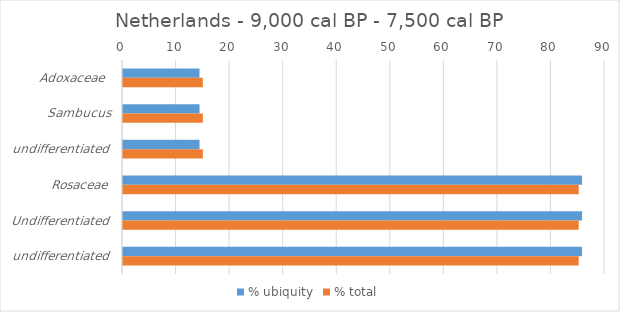
| Category | % ubiquity | % total |
|---|---|---|
| Adoxaceae  | 14.286 | 14.908 |
| Sambucus | 14.286 | 14.908 |
| undifferentiated | 14.286 | 14.908 |
| Rosaceae | 85.714 | 85.092 |
| Undifferentiated | 85.714 | 85.092 |
| undifferentiated | 85.714 | 85.092 |